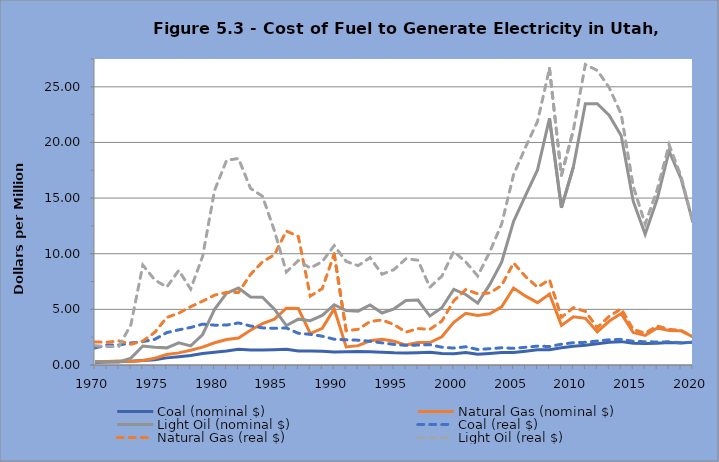
| Category | Coal (nominal $) | Natural Gas (nominal $) | Light Oil (nominal $) | Coal (real $) | Natural Gas (real $) | Light Oil (real $) |
|---|---|---|---|---|---|---|
| 1970.0 | 0.23 | 0.31 | 0.26 | 1.534 | 2.068 | 1.734 |
| 1971.0 | 0.28 | 0.32 | 0.26 | 1.789 | 2.045 | 1.662 |
| 1972.0 | 0.29 | 0.35 | 0.27 | 1.796 | 2.167 | 1.672 |
| 1973.0 | 0.34 | 0.32 | 0.62 | 1.982 | 1.865 | 3.614 |
| 1974.0 | 0.4 | 0.41 | 1.71 | 2.1 | 2.152 | 8.977 |
| 1975.0 | 0.48 | 0.61 | 1.59 | 2.309 | 2.934 | 7.649 |
| 1976.0 | 0.64 | 0.94 | 1.54 | 2.911 | 4.276 | 7.005 |
| 1977.0 | 0.74 | 1.09 | 1.99 | 3.16 | 4.655 | 8.499 |
| 1978.0 | 0.85 | 1.32 | 1.72 | 3.374 | 5.24 | 6.828 |
| 1979.0 | 1.03 | 1.61 | 2.74 | 3.672 | 5.739 | 9.768 |
| 1980.0 | 1.14 | 2 | 5 | 3.581 | 6.282 | 15.705 |
| 1981.0 | 1.26 | 2.29 | 6.46 | 3.587 | 6.52 | 18.393 |
| 1982.0 | 1.41 | 2.43 | 6.92 | 3.782 | 6.517 | 18.559 |
| 1983.0 | 1.35 | 3.13 | 6.11 | 3.508 | 8.133 | 15.877 |
| 1984.0 | 1.34 | 3.72 | 6.09 | 3.338 | 9.266 | 15.17 |
| 1985.0 | 1.37 | 4.12 | 5.02 | 3.295 | 9.91 | 12.075 |
| 1986.0 | 1.41 | 5.1 | 3.54 | 3.33 | 12.043 | 8.359 |
| 1987.0 | 1.25 | 5.07 | 4.12 | 2.848 | 11.551 | 9.386 |
| 1988.0 | 1.26 | 2.83 | 3.98 | 2.757 | 6.191 | 8.707 |
| 1989.0 | 1.24 | 3.29 | 4.45 | 2.588 | 6.867 | 9.288 |
| 1990.0 | 1.17 | 5.04 | 5.42 | 2.317 | 9.98 | 10.733 |
| 1991.0 | 1.19 | 1.62 | 4.9 | 2.261 | 3.078 | 9.311 |
| 1992.0 | 1.21 | 1.74 | 4.84 | 2.232 | 3.21 | 8.928 |
| 1993.0 | 1.19 | 2.18 | 5.39 | 2.131 | 3.905 | 9.654 |
| 1994.0 | 1.14 | 2.32 | 4.67 | 1.991 | 4.052 | 8.156 |
| 1995.0 | 1.09 | 2.14 | 5.05 | 1.851 | 3.634 | 8.576 |
| 1996.0 | 1.07 | 1.79 | 5.79 | 1.765 | 2.953 | 9.551 |
| 1997.0 | 1.11 | 2.03 | 5.84 | 1.79 | 3.273 | 9.417 |
| 1998.0 | 1.15 | 2.02 | 4.4 | 1.826 | 3.207 | 6.986 |
| 1999.0 | 1.03 | 2.54 | 5.14 | 1.6 | 3.946 | 7.985 |
| 2000.0 | 1.01 | 3.84 | 6.79 | 1.518 | 5.771 | 10.205 |
| 2001.0 | 1.12 | 4.64 | 6.34 | 1.637 | 6.781 | 9.265 |
| 2002.0 | 0.97 | 4.45 | 5.56 | 1.395 | 6.402 | 7.999 |
| 2003.0 | 1.04 | 4.6 | 7.22 | 1.463 | 6.47 | 10.156 |
| 2004.0 | 1.13 | 5.22 | 9.24 | 1.548 | 7.152 | 12.66 |
| 2005.0 | 1.13 | 6.92 | 12.91 | 1.497 | 9.17 | 17.108 |
| 2006.0 | 1.24 | 6.19 | 15.25 | 1.592 | 7.947 | 19.578 |
| 2007.0 | 1.36 | 5.6 | 17.53 | 1.698 | 6.992 | 21.886 |
| 2008.0 | 1.38 | 6.38 | 22.17 | 1.659 | 7.669 | 26.65 |
| 2009.0 | 1.55 | 3.56 | 14.13 | 1.87 | 4.295 | 17.046 |
| 2010.0 | 1.69 | 4.34 | 17.81 | 2.006 | 5.151 | 21.139 |
| 2011.0 | 1.77 | 4.19 | 23.47 | 2.037 | 4.821 | 27.004 |
| 2012.0 | 1.91 | 2.98 | 23.48 | 2.153 | 3.359 | 26.468 |
| 2013.0 | 2.04 | 3.95 | 22.43 | 2.266 | 4.388 | 24.919 |
| 2014.0 | 2.1 | 4.62 | 20.61 | 2.296 | 5.051 | 22.532 |
| 2015.0 | 1.95 | 2.92 | 14.72 | 2.129 | 3.188 | 16.074 |
| 2016.0 | 1.94 | 2.65 | 11.75 | 2.092 | 2.858 | 12.671 |
| 2017.0 | 1.96 | 3.32 | 14.9 | 2.069 | 3.505 | 15.732 |
| 2018.0 | 2.02 | 3.11 | 19.21 | 2.082 | 3.205 | 19.799 |
| 2019.0 | 1.97 | 3.07 | 16.75 | 1.994 | 3.108 | 16.957 |
| 2020.0 | 2.04 | 2.53 | 12.8 | 2.04 | 2.53 | 12.8 |